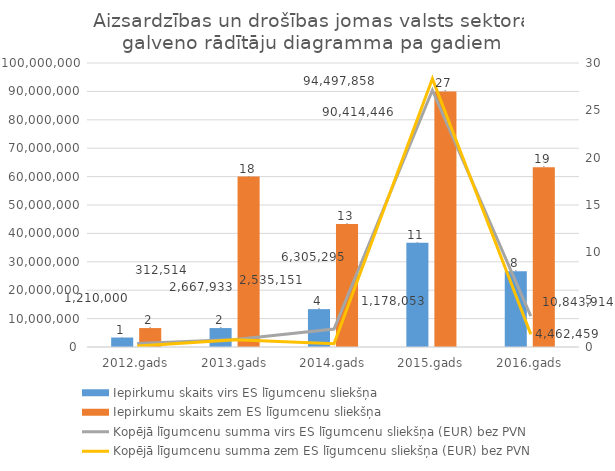
| Category | Iepirkumu skaits virs ES līgumcenu sliekšņa | Iepirkumu skaits zem ES līgumcenu sliekšņa |
|---|---|---|
| 2012.gads | 1 | 2 |
| 2013.gads | 2 | 18 |
| 2014.gads | 4 | 13 |
| 2015.gads | 11 | 27 |
| 2016.gads | 8 | 19 |